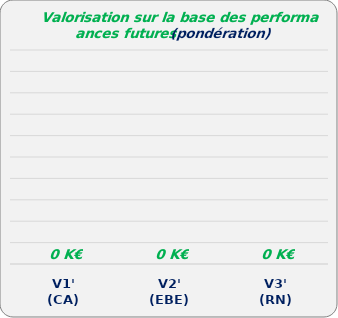
| Category | Series 0 |
|---|---|
| V1'
(CA) | 0 |
| V2'
(EBE) | 0 |
| V3'
(RN) | 0 |